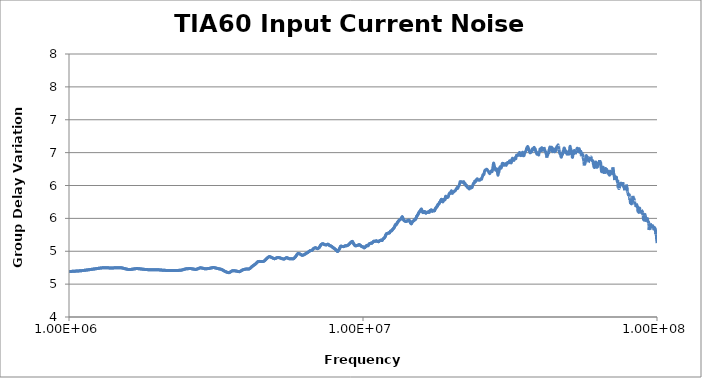
| Category | TIA60 |
|---|---|
| 0.0 | 28.058 |
| 100000.0 | 10.94 |
| 200000.0 | 4.725 |
| 300000.0 | 4.685 |
| 400000.0 | 4.685 |
| 500000.0 | 4.672 |
| 600000.0 | 4.673 |
| 700000.0 | 4.667 |
| 800000.0 | 4.66 |
| 900000.0 | 4.669 |
| 1000000.0 | 4.691 |
| 1100000.0 | 4.704 |
| 1200000.0 | 4.726 |
| 1300000.0 | 4.748 |
| 1400000.0 | 4.746 |
| 1500000.0 | 4.75 |
| 1600000.0 | 4.722 |
| 1700000.0 | 4.737 |
| 1800000.0 | 4.725 |
| 1900000.0 | 4.718 |
| 2000000.0 | 4.719 |
| 2100000.0 | 4.71 |
| 2200000.0 | 4.708 |
| 2300000.0 | 4.708 |
| 2400000.0 | 4.711 |
| 2500000.0 | 4.732 |
| 2600000.0 | 4.736 |
| 2700000.0 | 4.724 |
| 2800000.0 | 4.748 |
| 2900000.0 | 4.734 |
| 3000000.0 | 4.739 |
| 3100000.0 | 4.752 |
| 3200000.0 | 4.738 |
| 3300000.0 | 4.724 |
| 3400000.0 | 4.692 |
| 3500000.0 | 4.674 |
| 3600000.0 | 4.704 |
| 3700000.0 | 4.7 |
| 3800000.0 | 4.69 |
| 3900000.0 | 4.717 |
| 4000000.0 | 4.729 |
| 4100000.0 | 4.731 |
| 4200000.0 | 4.77 |
| 4300000.0 | 4.804 |
| 4400000.0 | 4.844 |
| 4500000.0 | 4.843 |
| 4600000.0 | 4.848 |
| 4700000.0 | 4.888 |
| 4800000.0 | 4.918 |
| 4900000.0 | 4.903 |
| 5000000.0 | 4.886 |
| 5100000.0 | 4.902 |
| 5200000.0 | 4.901 |
| 5300000.0 | 4.888 |
| 5400000.0 | 4.883 |
| 5500000.0 | 4.903 |
| 5600000.0 | 4.888 |
| 5700000.0 | 4.886 |
| 5800000.0 | 4.886 |
| 5900000.0 | 4.919 |
| 6000000.0 | 4.965 |
| 6100000.0 | 4.959 |
| 6200000.0 | 4.94 |
| 6300000.0 | 4.947 |
| 6400000.0 | 4.967 |
| 6500000.0 | 4.984 |
| 6600000.0 | 5.007 |
| 6700000.0 | 5.013 |
| 6800000.0 | 5.044 |
| 6900000.0 | 5.052 |
| 7000000.0 | 5.04 |
| 7100000.0 | 5.058 |
| 7200000.0 | 5.1 |
| 7300000.0 | 5.115 |
| 7400000.0 | 5.102 |
| 7500000.0 | 5.096 |
| 7600000.0 | 5.107 |
| 7700000.0 | 5.087 |
| 7800000.0 | 5.077 |
| 7900000.0 | 5.057 |
| 8000000.0 | 5.04 |
| 8100000.0 | 5.019 |
| 8200000.0 | 4.996 |
| 8300000.0 | 5.032 |
| 8400000.0 | 5.076 |
| 8500000.0 | 5.072 |
| 8600000.0 | 5.071 |
| 8700000.0 | 5.083 |
| 8800000.0 | 5.084 |
| 8900000.0 | 5.094 |
| 9000000.0 | 5.114 |
| 9100000.0 | 5.135 |
| 9200000.0 | 5.15 |
| 9300000.0 | 5.111 |
| 9400000.0 | 5.085 |
| 9500000.0 | 5.085 |
| 9600000.0 | 5.089 |
| 9700000.0 | 5.101 |
| 9800000.0 | 5.089 |
| 9900000.0 | 5.072 |
| 10000000.0 | 5.066 |
| 10100000.0 | 5.051 |
| 10200000.0 | 5.068 |
| 10300000.0 | 5.089 |
| 10400000.0 | 5.084 |
| 10500000.0 | 5.111 |
| 10600000.0 | 5.121 |
| 10700000.0 | 5.121 |
| 10800000.0 | 5.138 |
| 10900000.0 | 5.153 |
| 11000000.0 | 5.152 |
| 11100000.0 | 5.159 |
| 11200000.0 | 5.149 |
| 11300000.0 | 5.146 |
| 11400000.0 | 5.161 |
| 11500000.0 | 5.168 |
| 11600000.0 | 5.162 |
| 11700000.0 | 5.186 |
| 11800000.0 | 5.199 |
| 11900000.0 | 5.224 |
| 12000000.0 | 5.263 |
| 12100000.0 | 5.27 |
| 12200000.0 | 5.276 |
| 12300000.0 | 5.279 |
| 12400000.0 | 5.305 |
| 12500000.0 | 5.311 |
| 12600000.0 | 5.33 |
| 12700000.0 | 5.347 |
| 12800000.0 | 5.369 |
| 12900000.0 | 5.405 |
| 13000000.0 | 5.41 |
| 13100000.0 | 5.438 |
| 13200000.0 | 5.458 |
| 13300000.0 | 5.475 |
| 13400000.0 | 5.483 |
| 13500000.0 | 5.5 |
| 13600000.0 | 5.525 |
| 13700000.0 | 5.489 |
| 13800000.0 | 5.467 |
| 13900000.0 | 5.458 |
| 14000000.0 | 5.453 |
| 14100000.0 | 5.462 |
| 14200000.0 | 5.462 |
| 14300000.0 | 5.474 |
| 14400000.0 | 5.465 |
| 14500000.0 | 5.435 |
| 14600000.0 | 5.417 |
| 14700000.0 | 5.443 |
| 14800000.0 | 5.457 |
| 14900000.0 | 5.466 |
| 15000000.0 | 5.483 |
| 15100000.0 | 5.488 |
| 15200000.0 | 5.521 |
| 15300000.0 | 5.545 |
| 15400000.0 | 5.563 |
| 15500000.0 | 5.59 |
| 15600000.0 | 5.606 |
| 15700000.0 | 5.622 |
| 15800000.0 | 5.64 |
| 15900000.0 | 5.607 |
| 16000000.0 | 5.587 |
| 16100000.0 | 5.599 |
| 16200000.0 | 5.603 |
| 16300000.0 | 5.585 |
| 16400000.0 | 5.582 |
| 16500000.0 | 5.593 |
| 16600000.0 | 5.592 |
| 16700000.0 | 5.6 |
| 16800000.0 | 5.593 |
| 16900000.0 | 5.616 |
| 17000000.0 | 5.625 |
| 17100000.0 | 5.627 |
| 17200000.0 | 5.608 |
| 17300000.0 | 5.62 |
| 17400000.0 | 5.616 |
| 17500000.0 | 5.616 |
| 17600000.0 | 5.641 |
| 17700000.0 | 5.66 |
| 17800000.0 | 5.673 |
| 17900000.0 | 5.686 |
| 18000000.0 | 5.713 |
| 18100000.0 | 5.717 |
| 18200000.0 | 5.74 |
| 18300000.0 | 5.754 |
| 18400000.0 | 5.772 |
| 18500000.0 | 5.789 |
| 18600000.0 | 5.758 |
| 18700000.0 | 5.754 |
| 18800000.0 | 5.784 |
| 18900000.0 | 5.785 |
| 19000000.0 | 5.785 |
| 19100000.0 | 5.834 |
| 19200000.0 | 5.832 |
| 19300000.0 | 5.818 |
| 19400000.0 | 5.818 |
| 19500000.0 | 5.828 |
| 19600000.0 | 5.867 |
| 19700000.0 | 5.886 |
| 19800000.0 | 5.879 |
| 19900000.0 | 5.9 |
| 20000000.0 | 5.919 |
| 20100000.0 | 5.881 |
| 20200000.0 | 5.889 |
| 20300000.0 | 5.904 |
| 20400000.0 | 5.904 |
| 20500000.0 | 5.919 |
| 20600000.0 | 5.921 |
| 20700000.0 | 5.938 |
| 20800000.0 | 5.952 |
| 20900000.0 | 5.971 |
| 21000000.0 | 5.955 |
| 21100000.0 | 5.983 |
| 21200000.0 | 5.993 |
| 21300000.0 | 6.022 |
| 21400000.0 | 6.059 |
| 21500000.0 | 6.046 |
| 21600000.0 | 6.059 |
| 21700000.0 | 6.056 |
| 21800000.0 | 6.051 |
| 21900000.0 | 6.044 |
| 22000000.0 | 6.058 |
| 22100000.0 | 6.029 |
| 22200000.0 | 6.035 |
| 22300000.0 | 6.021 |
| 22400000.0 | 5.995 |
| 22500000.0 | 6.003 |
| 22600000.0 | 5.981 |
| 22700000.0 | 5.967 |
| 22800000.0 | 5.961 |
| 22900000.0 | 5.961 |
| 23000000.0 | 5.948 |
| 23100000.0 | 5.975 |
| 23200000.0 | 5.97 |
| 23300000.0 | 5.96 |
| 23400000.0 | 5.968 |
| 23500000.0 | 5.97 |
| 23600000.0 | 5.997 |
| 23700000.0 | 6.022 |
| 23800000.0 | 6.037 |
| 23900000.0 | 6.036 |
| 24000000.0 | 6.067 |
| 24100000.0 | 6.055 |
| 24200000.0 | 6.065 |
| 24300000.0 | 6.086 |
| 24400000.0 | 6.098 |
| 24500000.0 | 6.101 |
| 24600000.0 | 6.083 |
| 24700000.0 | 6.082 |
| 24800000.0 | 6.084 |
| 24900000.0 | 6.079 |
| 25000000.0 | 6.083 |
| 25100000.0 | 6.097 |
| 25200000.0 | 6.1 |
| 25300000.0 | 6.094 |
| 25400000.0 | 6.12 |
| 25500000.0 | 6.139 |
| 25600000.0 | 6.166 |
| 25700000.0 | 6.163 |
| 25800000.0 | 6.172 |
| 25900000.0 | 6.215 |
| 26000000.0 | 6.23 |
| 26100000.0 | 6.238 |
| 26200000.0 | 6.239 |
| 26300000.0 | 6.248 |
| 26400000.0 | 6.244 |
| 26500000.0 | 6.238 |
| 26600000.0 | 6.222 |
| 26700000.0 | 6.216 |
| 26800000.0 | 6.197 |
| 26900000.0 | 6.189 |
| 27000000.0 | 6.182 |
| 27100000.0 | 6.204 |
| 27200000.0 | 6.214 |
| 27300000.0 | 6.222 |
| 27400000.0 | 6.214 |
| 27500000.0 | 6.213 |
| 27600000.0 | 6.25 |
| 27700000.0 | 6.295 |
| 27800000.0 | 6.341 |
| 27900000.0 | 6.319 |
| 28000000.0 | 6.289 |
| 28100000.0 | 6.254 |
| 28200000.0 | 6.239 |
| 28300000.0 | 6.232 |
| 28400000.0 | 6.243 |
| 28500000.0 | 6.253 |
| 28600000.0 | 6.224 |
| 28700000.0 | 6.185 |
| 28800000.0 | 6.157 |
| 28900000.0 | 6.194 |
| 29000000.0 | 6.206 |
| 29100000.0 | 6.257 |
| 29200000.0 | 6.273 |
| 29300000.0 | 6.286 |
| 29400000.0 | 6.282 |
| 29500000.0 | 6.263 |
| 29600000.0 | 6.28 |
| 29700000.0 | 6.32 |
| 29800000.0 | 6.337 |
| 29900000.0 | 6.317 |
| 30000000.0 | 6.335 |
| 30100000.0 | 6.312 |
| 30200000.0 | 6.307 |
| 30300000.0 | 6.314 |
| 30400000.0 | 6.32 |
| 30500000.0 | 6.332 |
| 30600000.0 | 6.33 |
| 30700000.0 | 6.306 |
| 30800000.0 | 6.326 |
| 30900000.0 | 6.339 |
| 31000000.0 | 6.349 |
| 31100000.0 | 6.346 |
| 31200000.0 | 6.341 |
| 31300000.0 | 6.348 |
| 31400000.0 | 6.348 |
| 31500000.0 | 6.373 |
| 31600000.0 | 6.377 |
| 31700000.0 | 6.376 |
| 31800000.0 | 6.362 |
| 31900000.0 | 6.343 |
| 32000000.0 | 6.357 |
| 32100000.0 | 6.388 |
| 32200000.0 | 6.414 |
| 32300000.0 | 6.406 |
| 32400000.0 | 6.408 |
| 32500000.0 | 6.391 |
| 32600000.0 | 6.382 |
| 32700000.0 | 6.4 |
| 32800000.0 | 6.4 |
| 32900000.0 | 6.425 |
| 33000000.0 | 6.418 |
| 33100000.0 | 6.408 |
| 33200000.0 | 6.442 |
| 33300000.0 | 6.461 |
| 33400000.0 | 6.456 |
| 33500000.0 | 6.465 |
| 33600000.0 | 6.464 |
| 33700000.0 | 6.458 |
| 33800000.0 | 6.477 |
| 33900000.0 | 6.486 |
| 34000000.0 | 6.493 |
| 34100000.0 | 6.502 |
| 34200000.0 | 6.467 |
| 34300000.0 | 6.454 |
| 34400000.0 | 6.464 |
| 34500000.0 | 6.456 |
| 34600000.0 | 6.484 |
| 34700000.0 | 6.489 |
| 34800000.0 | 6.491 |
| 34900000.0 | 6.505 |
| 35000000.0 | 6.482 |
| 35100000.0 | 6.453 |
| 35200000.0 | 6.456 |
| 35300000.0 | 6.456 |
| 35400000.0 | 6.478 |
| 35500000.0 | 6.5 |
| 35600000.0 | 6.504 |
| 35700000.0 | 6.513 |
| 35800000.0 | 6.526 |
| 35900000.0 | 6.534 |
| 36000000.0 | 6.562 |
| 36100000.0 | 6.577 |
| 36200000.0 | 6.566 |
| 36300000.0 | 6.592 |
| 36400000.0 | 6.583 |
| 36500000.0 | 6.572 |
| 36600000.0 | 6.559 |
| 36700000.0 | 6.543 |
| 36800000.0 | 6.528 |
| 36900000.0 | 6.509 |
| 37000000.0 | 6.496 |
| 37100000.0 | 6.511 |
| 37200000.0 | 6.513 |
| 37300000.0 | 6.505 |
| 37400000.0 | 6.515 |
| 37500000.0 | 6.515 |
| 37600000.0 | 6.538 |
| 37700000.0 | 6.559 |
| 37800000.0 | 6.549 |
| 37900000.0 | 6.545 |
| 38000000.0 | 6.56 |
| 38100000.0 | 6.572 |
| 38200000.0 | 6.581 |
| 38300000.0 | 6.572 |
| 38400000.0 | 6.554 |
| 38500000.0 | 6.558 |
| 38600000.0 | 6.539 |
| 38700000.0 | 6.513 |
| 38800000.0 | 6.517 |
| 38900000.0 | 6.493 |
| 39000000.0 | 6.482 |
| 39100000.0 | 6.475 |
| 39200000.0 | 6.486 |
| 39300000.0 | 6.499 |
| 39400000.0 | 6.476 |
| 39500000.0 | 6.473 |
| 39600000.0 | 6.465 |
| 39700000.0 | 6.499 |
| 39800000.0 | 6.508 |
| 39900000.0 | 6.523 |
| 40000000.0 | 6.554 |
| 40100000.0 | 6.548 |
| 40200000.0 | 6.53 |
| 40300000.0 | 6.509 |
| 40400000.0 | 6.548 |
| 40500000.0 | 6.573 |
| 40600000.0 | 6.573 |
| 40700000.0 | 6.557 |
| 40800000.0 | 6.549 |
| 40900000.0 | 6.55 |
| 41000000.0 | 6.538 |
| 41100000.0 | 6.544 |
| 41200000.0 | 6.585 |
| 41300000.0 | 6.567 |
| 41400000.0 | 6.556 |
| 41500000.0 | 6.539 |
| 41600000.0 | 6.534 |
| 41700000.0 | 6.513 |
| 41800000.0 | 6.511 |
| 41900000.0 | 6.493 |
| 42000000.0 | 6.476 |
| 42100000.0 | 6.469 |
| 42200000.0 | 6.424 |
| 42300000.0 | 6.464 |
| 42400000.0 | 6.451 |
| 42500000.0 | 6.466 |
| 42600000.0 | 6.489 |
| 42700000.0 | 6.499 |
| 42800000.0 | 6.494 |
| 42900000.0 | 6.536 |
| 43000000.0 | 6.545 |
| 43100000.0 | 6.564 |
| 43200000.0 | 6.585 |
| 43300000.0 | 6.566 |
| 43400000.0 | 6.568 |
| 43500000.0 | 6.538 |
| 43600000.0 | 6.548 |
| 43700000.0 | 6.557 |
| 43800000.0 | 6.581 |
| 43900000.0 | 6.574 |
| 44000000.0 | 6.56 |
| 44100000.0 | 6.519 |
| 44200000.0 | 6.517 |
| 44300000.0 | 6.527 |
| 44400000.0 | 6.544 |
| 44500000.0 | 6.557 |
| 44600000.0 | 6.548 |
| 44700000.0 | 6.553 |
| 44800000.0 | 6.52 |
| 44900000.0 | 6.514 |
| 45000000.0 | 6.528 |
| 45100000.0 | 6.533 |
| 45200000.0 | 6.541 |
| 45300000.0 | 6.53 |
| 45400000.0 | 6.538 |
| 45500000.0 | 6.569 |
| 45600000.0 | 6.589 |
| 45700000.0 | 6.587 |
| 45800000.0 | 6.598 |
| 45900000.0 | 6.588 |
| 46000000.0 | 6.599 |
| 46100000.0 | 6.618 |
| 46200000.0 | 6.593 |
| 46300000.0 | 6.596 |
| 46400000.0 | 6.549 |
| 46500000.0 | 6.528 |
| 46600000.0 | 6.501 |
| 46700000.0 | 6.492 |
| 46800000.0 | 6.48 |
| 46900000.0 | 6.483 |
| 47000000.0 | 6.468 |
| 47100000.0 | 6.445 |
| 47200000.0 | 6.434 |
| 47300000.0 | 6.433 |
| 47400000.0 | 6.476 |
| 47500000.0 | 6.476 |
| 47600000.0 | 6.465 |
| 47700000.0 | 6.473 |
| 47800000.0 | 6.494 |
| 47900000.0 | 6.518 |
| 48000000.0 | 6.526 |
| 48100000.0 | 6.525 |
| 48200000.0 | 6.555 |
| 48300000.0 | 6.57 |
| 48400000.0 | 6.569 |
| 48500000.0 | 6.556 |
| 48600000.0 | 6.543 |
| 48700000.0 | 6.534 |
| 48800000.0 | 6.523 |
| 48900000.0 | 6.5 |
| 49000000.0 | 6.511 |
| 49100000.0 | 6.523 |
| 49200000.0 | 6.517 |
| 49300000.0 | 6.505 |
| 49400000.0 | 6.479 |
| 49500000.0 | 6.479 |
| 49600000.0 | 6.498 |
| 49700000.0 | 6.498 |
| 49800000.0 | 6.504 |
| 49900000.0 | 6.498 |
| 50000000.0 | 6.489 |
| 50100000.0 | 6.477 |
| 50200000.0 | 6.478 |
| 50300000.0 | 6.492 |
| 50400000.0 | 6.524 |
| 50500000.0 | 6.572 |
| 50600000.0 | 6.595 |
| 50700000.0 | 6.585 |
| 50800000.0 | 6.554 |
| 50900000.0 | 6.558 |
| 51000000.0 | 6.539 |
| 51100000.0 | 6.531 |
| 51200000.0 | 6.528 |
| 51300000.0 | 6.507 |
| 51400000.0 | 6.481 |
| 51500000.0 | 6.438 |
| 51600000.0 | 6.428 |
| 51700000.0 | 6.456 |
| 51800000.0 | 6.497 |
| 51900000.0 | 6.49 |
| 52000000.0 | 6.512 |
| 52100000.0 | 6.513 |
| 52200000.0 | 6.507 |
| 52300000.0 | 6.531 |
| 52400000.0 | 6.526 |
| 52500000.0 | 6.524 |
| 52600000.0 | 6.511 |
| 52700000.0 | 6.48 |
| 52800000.0 | 6.475 |
| 52900000.0 | 6.512 |
| 53000000.0 | 6.502 |
| 53100000.0 | 6.535 |
| 53200000.0 | 6.54 |
| 53300000.0 | 6.526 |
| 53400000.0 | 6.545 |
| 53500000.0 | 6.567 |
| 53600000.0 | 6.561 |
| 53700000.0 | 6.562 |
| 53800000.0 | 6.548 |
| 53900000.0 | 6.54 |
| 54000000.0 | 6.529 |
| 54100000.0 | 6.512 |
| 54200000.0 | 6.522 |
| 54300000.0 | 6.554 |
| 54400000.0 | 6.559 |
| 54500000.0 | 6.544 |
| 54600000.0 | 6.528 |
| 54700000.0 | 6.519 |
| 54800000.0 | 6.521 |
| 54900000.0 | 6.486 |
| 55000000.0 | 6.509 |
| 55100000.0 | 6.518 |
| 55200000.0 | 6.501 |
| 55300000.0 | 6.454 |
| 55400000.0 | 6.449 |
| 55500000.0 | 6.458 |
| 55600000.0 | 6.5 |
| 55700000.0 | 6.49 |
| 55800000.0 | 6.475 |
| 55900000.0 | 6.483 |
| 56000000.0 | 6.447 |
| 56100000.0 | 6.418 |
| 56200000.0 | 6.401 |
| 56300000.0 | 6.414 |
| 56400000.0 | 6.366 |
| 56500000.0 | 6.329 |
| 56600000.0 | 6.305 |
| 56700000.0 | 6.331 |
| 56800000.0 | 6.342 |
| 56900000.0 | 6.332 |
| 57000000.0 | 6.349 |
| 57100000.0 | 6.368 |
| 57200000.0 | 6.393 |
| 57300000.0 | 6.403 |
| 57400000.0 | 6.446 |
| 57500000.0 | 6.455 |
| 57600000.0 | 6.43 |
| 57700000.0 | 6.414 |
| 57800000.0 | 6.398 |
| 57900000.0 | 6.426 |
| 58000000.0 | 6.432 |
| 58100000.0 | 6.428 |
| 58200000.0 | 6.423 |
| 58300000.0 | 6.367 |
| 58400000.0 | 6.354 |
| 58500000.0 | 6.357 |
| 58600000.0 | 6.373 |
| 58700000.0 | 6.391 |
| 58800000.0 | 6.423 |
| 58900000.0 | 6.404 |
| 59000000.0 | 6.402 |
| 59100000.0 | 6.407 |
| 59200000.0 | 6.401 |
| 59300000.0 | 6.435 |
| 59400000.0 | 6.428 |
| 59500000.0 | 6.423 |
| 59600000.0 | 6.432 |
| 59700000.0 | 6.429 |
| 59800000.0 | 6.406 |
| 59900000.0 | 6.385 |
| 60000000.0 | 6.388 |
| 60100000.0 | 6.384 |
| 60200000.0 | 6.378 |
| 60300000.0 | 6.374 |
| 60400000.0 | 6.379 |
| 60500000.0 | 6.375 |
| 60600000.0 | 6.369 |
| 60700000.0 | 6.339 |
| 60800000.0 | 6.318 |
| 60900000.0 | 6.308 |
| 61000000.0 | 6.287 |
| 61100000.0 | 6.285 |
| 61200000.0 | 6.274 |
| 61300000.0 | 6.274 |
| 61400000.0 | 6.282 |
| 61500000.0 | 6.293 |
| 61600000.0 | 6.29 |
| 61700000.0 | 6.305 |
| 61800000.0 | 6.32 |
| 61900000.0 | 6.352 |
| 62000000.0 | 6.355 |
| 62100000.0 | 6.335 |
| 62200000.0 | 6.328 |
| 62300000.0 | 6.304 |
| 62400000.0 | 6.29 |
| 62500000.0 | 6.276 |
| 62600000.0 | 6.283 |
| 62700000.0 | 6.289 |
| 62800000.0 | 6.29 |
| 62900000.0 | 6.288 |
| 63000000.0 | 6.311 |
| 63100000.0 | 6.325 |
| 63200000.0 | 6.317 |
| 63300000.0 | 6.321 |
| 63400000.0 | 6.334 |
| 63500000.0 | 6.351 |
| 63600000.0 | 6.359 |
| 63700000.0 | 6.363 |
| 63800000.0 | 6.386 |
| 63900000.0 | 6.369 |
| 64000000.0 | 6.344 |
| 64100000.0 | 6.342 |
| 64200000.0 | 6.354 |
| 64300000.0 | 6.349 |
| 64400000.0 | 6.328 |
| 64500000.0 | 6.285 |
| 64600000.0 | 6.251 |
| 64700000.0 | 6.224 |
| 64800000.0 | 6.211 |
| 64900000.0 | 6.215 |
| 65000000.0 | 6.208 |
| 65100000.0 | 6.217 |
| 65200000.0 | 6.229 |
| 65300000.0 | 6.233 |
| 65400000.0 | 6.239 |
| 65500000.0 | 6.266 |
| 65600000.0 | 6.277 |
| 65700000.0 | 6.268 |
| 65800000.0 | 6.248 |
| 65900000.0 | 6.22 |
| 66000000.0 | 6.218 |
| 66100000.0 | 6.204 |
| 66200000.0 | 6.178 |
| 66300000.0 | 6.203 |
| 66400000.0 | 6.22 |
| 66500000.0 | 6.219 |
| 66600000.0 | 6.237 |
| 66700000.0 | 6.263 |
| 66800000.0 | 6.253 |
| 66900000.0 | 6.259 |
| 67000000.0 | 6.25 |
| 67100000.0 | 6.246 |
| 67200000.0 | 6.262 |
| 67300000.0 | 6.241 |
| 67400000.0 | 6.21 |
| 67500000.0 | 6.225 |
| 67600000.0 | 6.213 |
| 67700000.0 | 6.19 |
| 67800000.0 | 6.202 |
| 67900000.0 | 6.223 |
| 68000000.0 | 6.219 |
| 68100000.0 | 6.195 |
| 68200000.0 | 6.172 |
| 68300000.0 | 6.182 |
| 68400000.0 | 6.197 |
| 68500000.0 | 6.18 |
| 68600000.0 | 6.168 |
| 68700000.0 | 6.179 |
| 68800000.0 | 6.172 |
| 68900000.0 | 6.158 |
| 69000000.0 | 6.162 |
| 69100000.0 | 6.188 |
| 69200000.0 | 6.212 |
| 69300000.0 | 6.217 |
| 69400000.0 | 6.209 |
| 69500000.0 | 6.196 |
| 69600000.0 | 6.203 |
| 69700000.0 | 6.192 |
| 69800000.0 | 6.168 |
| 69900000.0 | 6.183 |
| 70000000.0 | 6.19 |
| 70100000.0 | 6.186 |
| 70200000.0 | 6.191 |
| 70300000.0 | 6.178 |
| 70400000.0 | 6.179 |
| 70500000.0 | 6.195 |
| 70600000.0 | 6.216 |
| 70700000.0 | 6.24 |
| 70800000.0 | 6.276 |
| 70900000.0 | 6.254 |
| 71000000.0 | 6.245 |
| 71100000.0 | 6.218 |
| 71200000.0 | 6.188 |
| 71300000.0 | 6.175 |
| 71400000.0 | 6.168 |
| 71500000.0 | 6.158 |
| 71600000.0 | 6.133 |
| 71700000.0 | 6.095 |
| 71800000.0 | 6.084 |
| 71900000.0 | 6.112 |
| 72000000.0 | 6.1 |
| 72100000.0 | 6.121 |
| 72200000.0 | 6.133 |
| 72300000.0 | 6.132 |
| 72400000.0 | 6.122 |
| 72500000.0 | 6.103 |
| 72600000.0 | 6.099 |
| 72700000.0 | 6.133 |
| 72800000.0 | 6.138 |
| 72900000.0 | 6.1 |
| 73000000.0 | 6.091 |
| 73100000.0 | 6.075 |
| 73200000.0 | 6.077 |
| 73300000.0 | 6.063 |
| 73400000.0 | 6.058 |
| 73500000.0 | 6.08 |
| 73600000.0 | 6.036 |
| 73700000.0 | 5.976 |
| 73800000.0 | 5.968 |
| 73900000.0 | 5.984 |
| 74000000.0 | 5.979 |
| 74100000.0 | 5.963 |
| 74200000.0 | 5.954 |
| 74300000.0 | 5.971 |
| 74400000.0 | 5.971 |
| 74500000.0 | 5.96 |
| 74600000.0 | 5.988 |
| 74700000.0 | 6.011 |
| 74800000.0 | 6.01 |
| 74900000.0 | 6.004 |
| 75000000.0 | 6.021 |
| 75100000.0 | 6.034 |
| 75200000.0 | 6.03 |
| 75300000.0 | 6.035 |
| 75400000.0 | 6.032 |
| 75500000.0 | 6.014 |
| 75600000.0 | 6.022 |
| 75700000.0 | 6.033 |
| 75800000.0 | 6.025 |
| 75900000.0 | 6.025 |
| 76000000.0 | 6.009 |
| 76100000.0 | 6.003 |
| 76200000.0 | 6.01 |
| 76300000.0 | 5.996 |
| 76400000.0 | 6.024 |
| 76500000.0 | 6.05 |
| 76600000.0 | 6.024 |
| 76700000.0 | 6.007 |
| 76800000.0 | 5.998 |
| 76900000.0 | 5.995 |
| 77000000.0 | 5.983 |
| 77100000.0 | 5.989 |
| 77200000.0 | 5.979 |
| 77300000.0 | 5.989 |
| 77400000.0 | 5.966 |
| 77500000.0 | 5.942 |
| 77600000.0 | 5.928 |
| 77700000.0 | 5.948 |
| 77800000.0 | 5.954 |
| 77900000.0 | 5.963 |
| 78000000.0 | 5.991 |
| 78100000.0 | 5.986 |
| 78200000.0 | 5.978 |
| 78300000.0 | 5.981 |
| 78400000.0 | 5.98 |
| 78500000.0 | 5.984 |
| 78600000.0 | 6.014 |
| 78700000.0 | 6.009 |
| 78800000.0 | 6.005 |
| 78900000.0 | 5.988 |
| 79000000.0 | 5.973 |
| 79100000.0 | 5.967 |
| 79200000.0 | 5.95 |
| 79300000.0 | 5.907 |
| 79400000.0 | 5.893 |
| 79500000.0 | 5.89 |
| 79600000.0 | 5.879 |
| 79700000.0 | 5.876 |
| 79800000.0 | 5.869 |
| 79900000.0 | 5.858 |
| 80000000.0 | 5.866 |
| 80100000.0 | 5.847 |
| 80200000.0 | 5.858 |
| 80300000.0 | 5.872 |
| 80400000.0 | 5.874 |
| 80500000.0 | 5.838 |
| 80600000.0 | 5.831 |
| 80700000.0 | 5.811 |
| 80800000.0 | 5.796 |
| 80900000.0 | 5.805 |
| 81000000.0 | 5.78 |
| 81100000.0 | 5.76 |
| 81200000.0 | 5.738 |
| 81300000.0 | 5.732 |
| 81400000.0 | 5.721 |
| 81500000.0 | 5.748 |
| 81600000.0 | 5.732 |
| 81700000.0 | 5.723 |
| 81800000.0 | 5.721 |
| 81900000.0 | 5.721 |
| 82000000.0 | 5.732 |
| 82100000.0 | 5.767 |
| 82200000.0 | 5.785 |
| 82300000.0 | 5.778 |
| 82400000.0 | 5.771 |
| 82500000.0 | 5.77 |
| 82600000.0 | 5.788 |
| 82700000.0 | 5.804 |
| 82800000.0 | 5.842 |
| 82900000.0 | 5.826 |
| 83000000.0 | 5.807 |
| 83100000.0 | 5.802 |
| 83200000.0 | 5.779 |
| 83300000.0 | 5.793 |
| 83400000.0 | 5.794 |
| 83500000.0 | 5.798 |
| 83600000.0 | 5.793 |
| 83700000.0 | 5.781 |
| 83800000.0 | 5.761 |
| 83900000.0 | 5.752 |
| 84000000.0 | 5.756 |
| 84100000.0 | 5.707 |
| 84200000.0 | 5.708 |
| 84300000.0 | 5.706 |
| 84400000.0 | 5.707 |
| 84500000.0 | 5.698 |
| 84600000.0 | 5.698 |
| 84700000.0 | 5.697 |
| 84800000.0 | 5.675 |
| 84900000.0 | 5.681 |
| 85000000.0 | 5.679 |
| 85100000.0 | 5.725 |
| 85200000.0 | 5.725 |
| 85300000.0 | 5.705 |
| 85400000.0 | 5.701 |
| 85500000.0 | 5.699 |
| 85600000.0 | 5.681 |
| 85700000.0 | 5.676 |
| 85800000.0 | 5.682 |
| 85900000.0 | 5.667 |
| 86000000.0 | 5.635 |
| 86100000.0 | 5.614 |
| 86200000.0 | 5.605 |
| 86300000.0 | 5.603 |
| 86400000.0 | 5.608 |
| 86500000.0 | 5.607 |
| 86600000.0 | 5.605 |
| 86700000.0 | 5.592 |
| 86800000.0 | 5.595 |
| 86900000.0 | 5.612 |
| 87000000.0 | 5.622 |
| 87100000.0 | 5.638 |
| 87200000.0 | 5.65 |
| 87300000.0 | 5.656 |
| 87400000.0 | 5.639 |
| 87500000.0 | 5.617 |
| 87600000.0 | 5.62 |
| 87700000.0 | 5.614 |
| 87800000.0 | 5.607 |
| 87900000.0 | 5.616 |
| 88000000.0 | 5.622 |
| 88100000.0 | 5.592 |
| 88200000.0 | 5.595 |
| 88300000.0 | 5.592 |
| 88400000.0 | 5.604 |
| 88500000.0 | 5.629 |
| 88600000.0 | 5.625 |
| 88700000.0 | 5.622 |
| 88800000.0 | 5.611 |
| 88900000.0 | 5.593 |
| 89000000.0 | 5.586 |
| 89100000.0 | 5.601 |
| 89200000.0 | 5.601 |
| 89300000.0 | 5.598 |
| 89400000.0 | 5.589 |
| 89500000.0 | 5.552 |
| 89600000.0 | 5.544 |
| 89700000.0 | 5.541 |
| 89800000.0 | 5.531 |
| 89900000.0 | 5.501 |
| 90000000.0 | 5.484 |
| 90100000.0 | 5.479 |
| 90200000.0 | 5.487 |
| 90300000.0 | 5.478 |
| 90400000.0 | 5.472 |
| 90500000.0 | 5.482 |
| 90600000.0 | 5.496 |
| 90700000.0 | 5.516 |
| 90800000.0 | 5.513 |
| 90900000.0 | 5.54 |
| 91000000.0 | 5.559 |
| 91100000.0 | 5.555 |
| 91200000.0 | 5.532 |
| 91300000.0 | 5.531 |
| 91400000.0 | 5.51 |
| 91500000.0 | 5.506 |
| 91600000.0 | 5.477 |
| 91700000.0 | 5.467 |
| 91800000.0 | 5.479 |
| 91900000.0 | 5.476 |
| 92000000.0 | 5.487 |
| 92100000.0 | 5.5 |
| 92200000.0 | 5.498 |
| 92300000.0 | 5.472 |
| 92400000.0 | 5.495 |
| 92500000.0 | 5.497 |
| 92600000.0 | 5.511 |
| 92700000.0 | 5.486 |
| 92800000.0 | 5.468 |
| 92900000.0 | 5.47 |
| 93000000.0 | 5.474 |
| 93100000.0 | 5.458 |
| 93200000.0 | 5.449 |
| 93300000.0 | 5.452 |
| 93400000.0 | 5.442 |
| 93500000.0 | 5.444 |
| 93600000.0 | 5.445 |
| 93700000.0 | 5.439 |
| 93800000.0 | 5.421 |
| 93900000.0 | 5.375 |
| 94000000.0 | 5.324 |
| 94100000.0 | 5.327 |
| 94200000.0 | 5.349 |
| 94300000.0 | 5.371 |
| 94400000.0 | 5.366 |
| 94500000.0 | 5.342 |
| 94600000.0 | 5.33 |
| 94700000.0 | 5.345 |
| 94800000.0 | 5.357 |
| 94900000.0 | 5.385 |
| 95000000.0 | 5.423 |
| 95100000.0 | 5.408 |
| 95200000.0 | 5.375 |
| 95300000.0 | 5.355 |
| 95400000.0 | 5.37 |
| 95500000.0 | 5.381 |
| 95600000.0 | 5.392 |
| 95700000.0 | 5.389 |
| 95800000.0 | 5.393 |
| 95900000.0 | 5.386 |
| 96000000.0 | 5.373 |
| 96100000.0 | 5.376 |
| 96200000.0 | 5.379 |
| 96300000.0 | 5.389 |
| 96400000.0 | 5.383 |
| 96500000.0 | 5.384 |
| 96600000.0 | 5.385 |
| 96700000.0 | 5.387 |
| 96800000.0 | 5.371 |
| 96900000.0 | 5.372 |
| 97000000.0 | 5.371 |
| 97100000.0 | 5.366 |
| 97200000.0 | 5.347 |
| 97300000.0 | 5.363 |
| 97400000.0 | 5.363 |
| 97500000.0 | 5.35 |
| 97600000.0 | 5.331 |
| 97700000.0 | 5.327 |
| 97800000.0 | 5.347 |
| 97900000.0 | 5.346 |
| 98000000.0 | 5.357 |
| 98100000.0 | 5.36 |
| 98200000.0 | 5.349 |
| 98300000.0 | 5.329 |
| 98400000.0 | 5.326 |
| 98500000.0 | 5.332 |
| 98600000.0 | 5.342 |
| 98700000.0 | 5.336 |
| 98800000.0 | 5.317 |
| 98900000.0 | 5.304 |
| 99000000.0 | 5.273 |
| 99100000.0 | 5.26 |
| 99200000.0 | 5.287 |
| 99300000.0 | 5.282 |
| 99400000.0 | 5.25 |
| 99500000.0 | 5.239 |
| 99600000.0 | 5.206 |
| 99700000.0 | 5.185 |
| 99800000.0 | 5.176 |
| 99900000.0 | 5.153 |
| 100000000.0 | 5.124 |